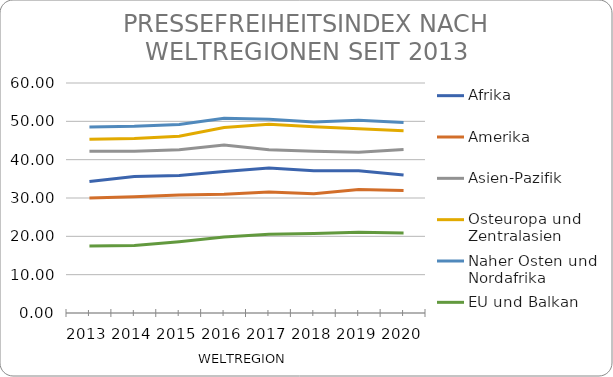
| Category | Afrika | Amerika | Asien-Pazifik | Osteuropa und Zentralasien | Naher Osten und Nordafrika | EU und Balkan |
|---|---|---|---|---|---|---|
| 2013.0 | 34.3 | 30 | 42.2 | 45.3 | 48.5 | 17.5 |
| 2014.0 | 35.6 | 30.3 | 42.2 | 45.5 | 48.7 | 17.6 |
| 2015.0 | 35.9 | 30.8 | 42.6 | 46.1 | 49.2 | 18.6 |
| 2016.0 | 36.9 | 30.959 | 43.82 | 48.4 | 50.81 | 19.8 |
| 2017.0 | 37.855 | 31.568 | 42.569 | 49.239 | 50.531 | 20.554 |
| 2018.0 | 37.095 | 31.107 | 42.225 | 48.562 | 49.856 | 20.738 |
| 2019.0 | 37.139 | 32.217 | 41.961 | 48.033 | 50.264 | 21.094 |
| 2020.0 | 35.992 | 31.963 | 42.68 | 47.517 | 49.708 | 20.878 |